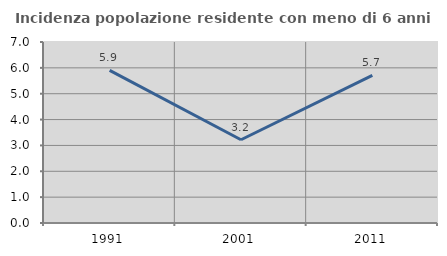
| Category | Incidenza popolazione residente con meno di 6 anni |
|---|---|
| 1991.0 | 5.902 |
| 2001.0 | 3.22 |
| 2011.0 | 5.709 |